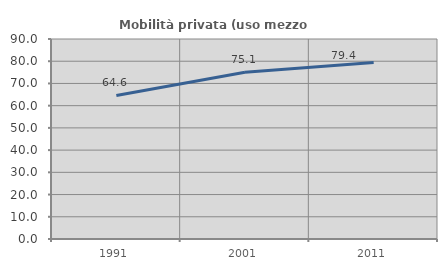
| Category | Mobilità privata (uso mezzo privato) |
|---|---|
| 1991.0 | 64.592 |
| 2001.0 | 75.05 |
| 2011.0 | 79.408 |